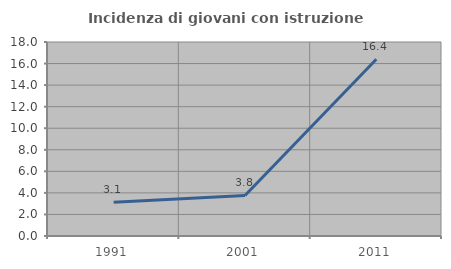
| Category | Incidenza di giovani con istruzione universitaria |
|---|---|
| 1991.0 | 3.141 |
| 2001.0 | 3.763 |
| 2011.0 | 16.406 |